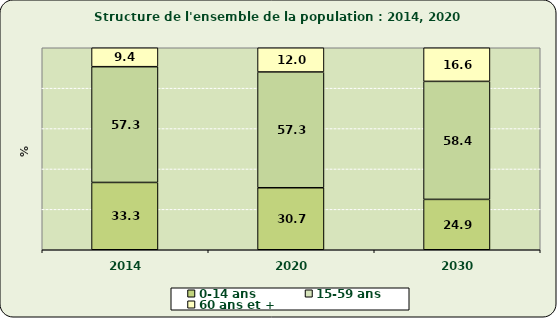
| Category | 0-14 ans  | 15-59 ans | 60 ans et + |
|---|---|---|---|
| 2014.0 | 33.316 | 57.315 | 9.37 |
| 2020.0 | 30.7 | 57.304 | 11.996 |
| 2030.0 | 24.933 | 58.426 | 16.641 |